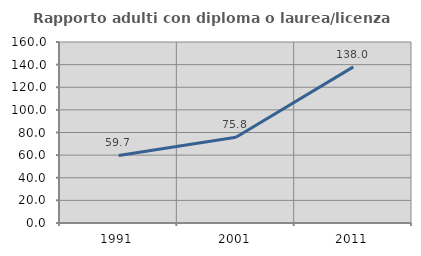
| Category | Rapporto adulti con diploma o laurea/licenza media  |
|---|---|
| 1991.0 | 59.677 |
| 2001.0 | 75.758 |
| 2011.0 | 138 |